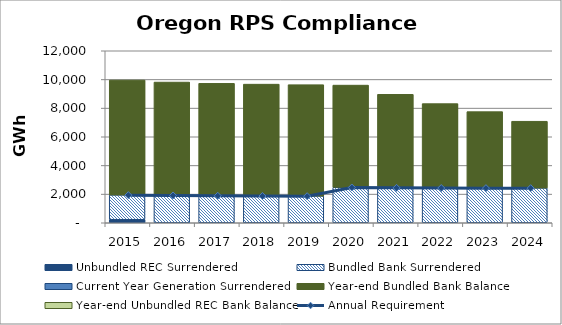
| Category | Unbundled REC Surrendered | Bundled Bank Surrendered | Current Year Generation Surrendered | Compliance Shortfall | Year-end Bundled Bank Balance | Year-end Unbundled REC Bank Balance |
|---|---|---|---|---|---|---|
| 2015.0 | 210.437 | 1733.909 | 0 | 0 | 8013.06 | 0 |
| 2016.0 | 0 | 1919.763 | 0 | 0 | 7898.858 | 0 |
| 2017.0 | 0 | 1898.704 | 0 | 0 | 7830.804 | 0 |
| 2018.0 | 0 | 1881.084 | 0 | 0 | 7792.038 | 0 |
| 2019.0 | 0 | 1869.518 | 0 | 0 | 7766.965 | 0 |
| 2020.0 | 0 | 2476.766 | 0 | 0 | 7128.878 | 0 |
| 2021.0 | 0 | 2451.115 | 0 | 0 | 6512.461 | 0 |
| 2022.0 | 0 | 2438.901 | 0 | 0 | 5875.235 | 0 |
| 2023.0 | 0 | 2431.294 | 0 | 0 | 5321.879 | 0 |
| 2024.0 | 0 | 2429.36 | 0 | 0 | 4656.11 | 0 |